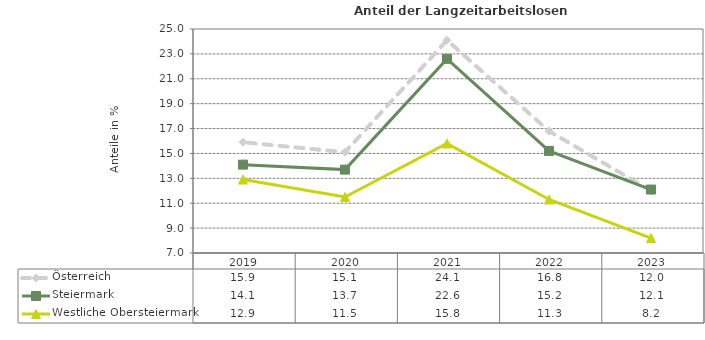
| Category | Österreich | Steiermark | Westliche Obersteiermark |
|---|---|---|---|
| 2023.0 | 12 | 12.1 | 8.2 |
| 2022.0 | 16.8 | 15.2 | 11.3 |
| 2021.0 | 24.1 | 22.6 | 15.8 |
| 2020.0 | 15.1 | 13.7 | 11.5 |
| 2019.0 | 15.9 | 14.1 | 12.9 |